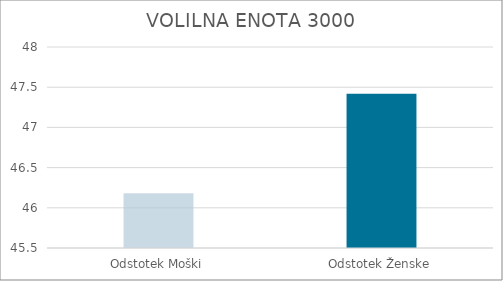
| Category | Series 0 |
|---|---|
| Odstotek Moški | 46.18 |
| Odstotek Ženske | 47.42 |